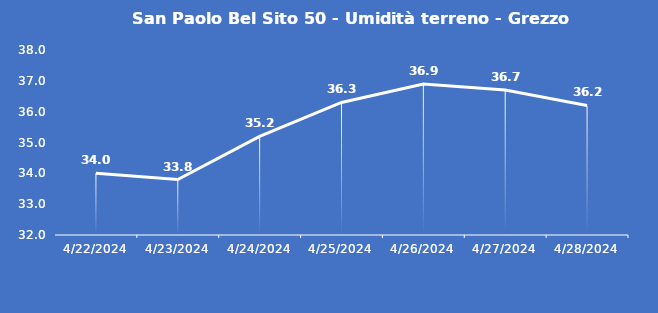
| Category | San Paolo Bel Sito 50 - Umidità terreno - Grezzo (%VWC) |
|---|---|
| 4/22/24 | 34 |
| 4/23/24 | 33.8 |
| 4/24/24 | 35.2 |
| 4/25/24 | 36.3 |
| 4/26/24 | 36.9 |
| 4/27/24 | 36.7 |
| 4/28/24 | 36.2 |